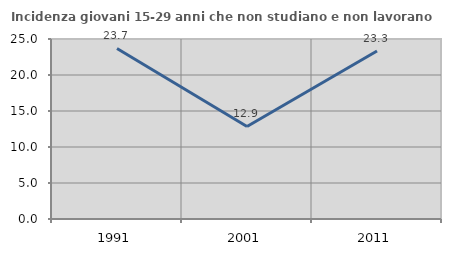
| Category | Incidenza giovani 15-29 anni che non studiano e non lavorano  |
|---|---|
| 1991.0 | 23.692 |
| 2001.0 | 12.857 |
| 2011.0 | 23.333 |